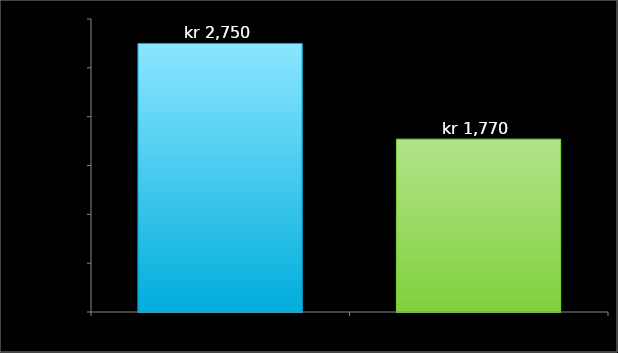
| Category | Data |
|---|---|
| inntekter | 2750 |
| utgifter | 1770 |